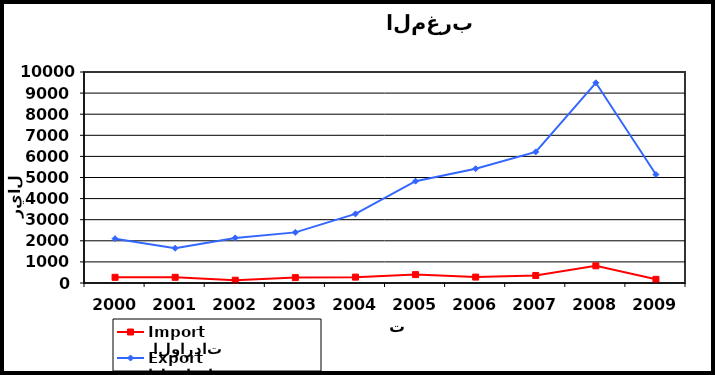
| Category |  الواردات           Import | الصادرات          Export |
|---|---|---|
| 2000.0 | 269 | 2100 |
| 2001.0 | 270 | 1649 |
| 2002.0 | 133 | 2137 |
| 2003.0 | 255 | 2399 |
| 2004.0 | 278 | 3275 |
| 2005.0 | 397 | 4827 |
| 2006.0 | 280 | 5417 |
| 2007.0 | 357 | 6214 |
| 2008.0 | 815 | 9489 |
| 2009.0 | 174 | 5141 |